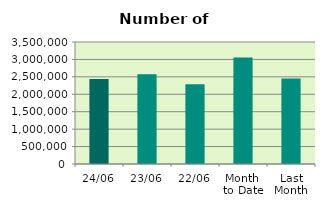
| Category | Series 0 |
|---|---|
| 24/06 | 2441958 |
| 23/06 | 2574434 |
| 22/06 | 2288620 |
| Month 
to Date | 3058338 |
| Last
Month | 2451339.2 |